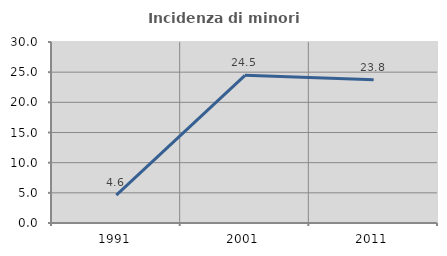
| Category | Incidenza di minori stranieri |
|---|---|
| 1991.0 | 4.63 |
| 2001.0 | 24.479 |
| 2011.0 | 23.752 |